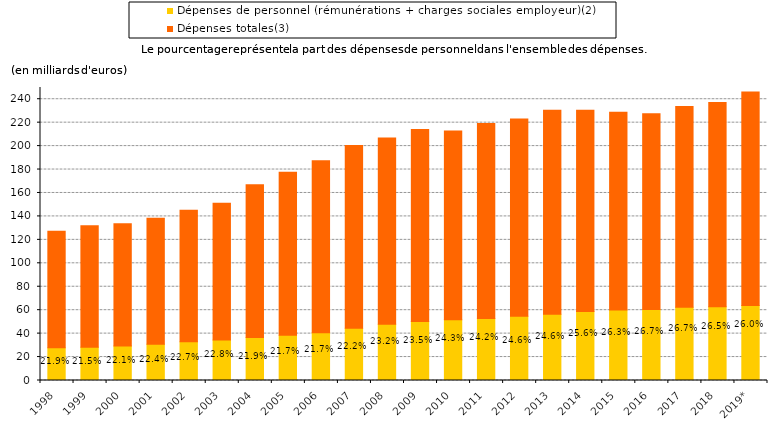
| Category | Dépenses de personnel (rémunérations + charges sociales employeur)(2) | Dépenses totales(3) |                                                  % |
|---|---|---|---|
| 1998 | 27.84 | 99.428 | 0.219 |
| 1999 | 28.43 | 103.617 | 0.215 |
| 2000 | 29.502 | 104.27 | 0.221 |
| 2001 | 30.977 | 107.475 | 0.224 |
| 2002 | 32.984 | 112.367 | 0.227 |
| 2003 | 34.543 | 116.645 | 0.228 |
| 2004 | 36.621 | 130.39 | 0.219 |
| 2005 | 38.569 | 139.218 | 0.217 |
| 2006 | 40.7 | 146.866 | 0.217 |
| 2007 | 44.509 | 156.081 | 0.222 |
| 2008 | 48.035 | 158.785 | 0.232 |
| 2009 | 50.3 | 163.93 | 0.235 |
| 2010 | 51.74 | 161.08 | 0.243 |
| 2011 | 52.998 | 166.387 | 0.242 |
| 2012 | 54.896 | 168.281 | 0.246 |
| 2013 | 56.628 | 174.036 | 0.246 |
| 2014 | 58.976 | 171.523 | 0.256 |
| 2015 | 60.119 | 168.863 | 0.263 |
| 2016 | 60.677 | 166.85 | 0.267 |
| 2017 | 62.41 | 171.347 | 0.267 |
| 2018 | 62.951 | 174.205 | 0.265 |
| 2019* | 63.923 | 182.175 | 0.26 |